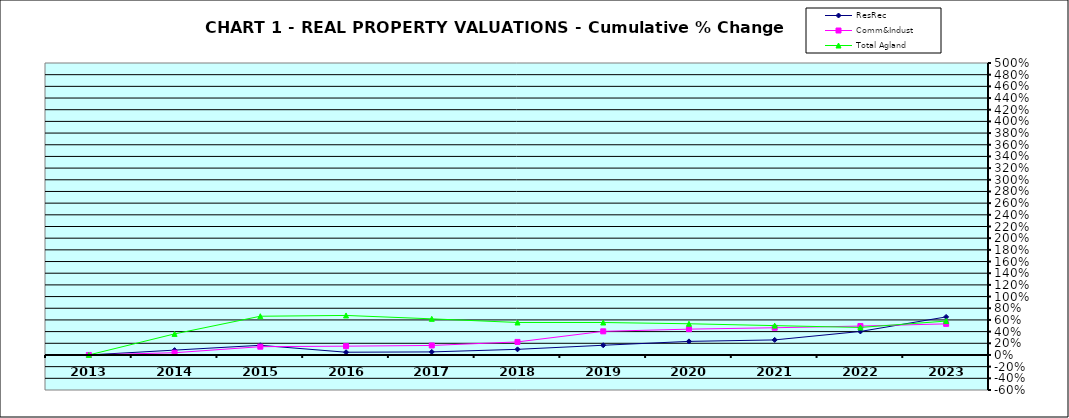
| Category | ResRec | Comm&Indust | Total Agland |
|---|---|---|---|
| 2013.0 | 0 | 0 | 0 |
| 2014.0 | 0.083 | 0.038 | 0.361 |
| 2015.0 | 0.165 | 0.142 | 0.663 |
| 2016.0 | 0.047 | 0.151 | 0.677 |
| 2017.0 | 0.052 | 0.163 | 0.619 |
| 2018.0 | 0.096 | 0.223 | 0.556 |
| 2019.0 | 0.166 | 0.405 | 0.556 |
| 2020.0 | 0.233 | 0.442 | 0.534 |
| 2021.0 | 0.258 | 0.466 | 0.503 |
| 2022.0 | 0.403 | 0.495 | 0.471 |
| 2023.0 | 0.652 | 0.533 | 0.58 |